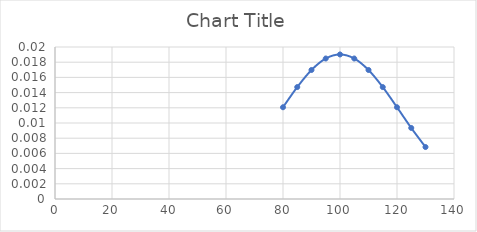
| Category | Series 0 |
|---|---|
| 80.0 | 0.012 |
| 85.0 | 0.015 |
| 90.0 | 0.017 |
| 95.0 | 0.018 |
| 100.0 | 0.019 |
| 105.0 | 0.018 |
| 110.0 | 0.017 |
| 115.0 | 0.015 |
| 120.0 | 0.012 |
| 125.0 | 0.009 |
| 130.0 | 0.007 |